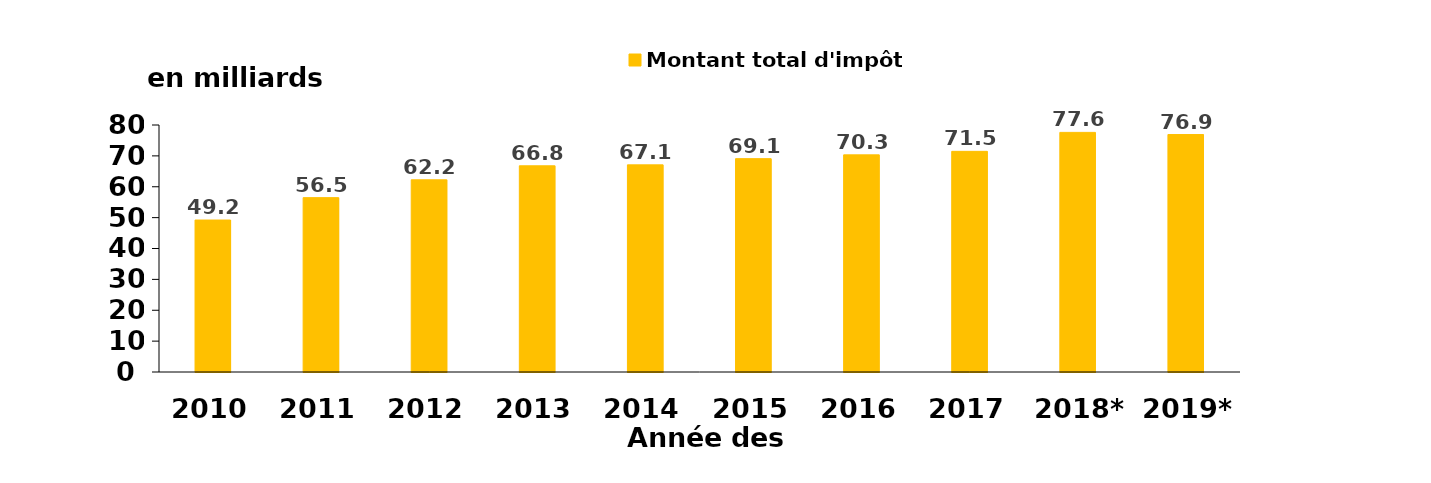
| Category | Montant total d'impôt |
|---|---|
| 2010 | 49.218 |
| 2011 | 56.475 |
| 2012 | 62.242 |
| 2013 | 66.784 |
| 2014 | 67.086 |
| 2015 | 69.102 |
| 2016 | 70.327 |
| 2017 | 71.467 |
| 2018* | 77.607 |
| 2019* | 76.911 |